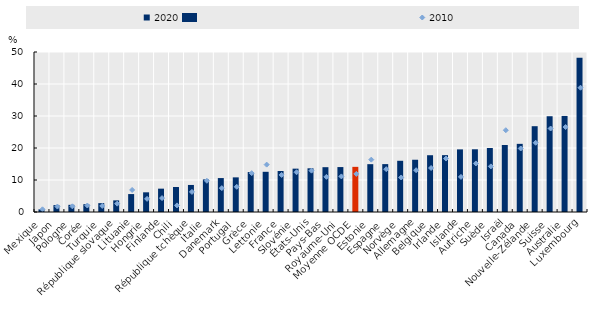
| Category | 2020 |
|---|---|
| Mexique | 0.852 |
| Japon | 2.153 |
| Pologne | 2.244 |
| Corée | 2.437 |
| Turquie | 2.767 |
| République slovaque | 3.634 |
| Lituanie | 5.605 |
| Hongrie | 6.152 |
| Finlande | 7.295 |
| Chili | 7.808 |
| République tchèque | 8.451 |
| Italie | 10.191 |
| Danemark | 10.607 |
| Portugal | 10.824 |
| Grèce | 12.484 |
| Lettonie | 12.563 |
| France | 12.811 |
| Slovénie | 13.546 |
| États-Unis | 13.655 |
| Pays-Bas | 14.005 |
| Royaume-Uni | 14.041 |
| Moyenne OCDE | 14.108 |
| Estonie | 14.949 |
| Espagne | 14.965 |
| Norvège | 16.007 |
| Allemagne | 16.33 |
| Belgique | 17.744 |
| Irlande | 17.772 |
| Islande | 19.566 |
| Autriche | 19.601 |
| Suède | 19.999 |
| Israël | 20.937 |
| Canada | 21.298 |
| Nouvelle-Zélande | 26.813 |
| Suisse | 29.927 |
| Australie | 30.016 |
| Luxembourg | 48.195 |